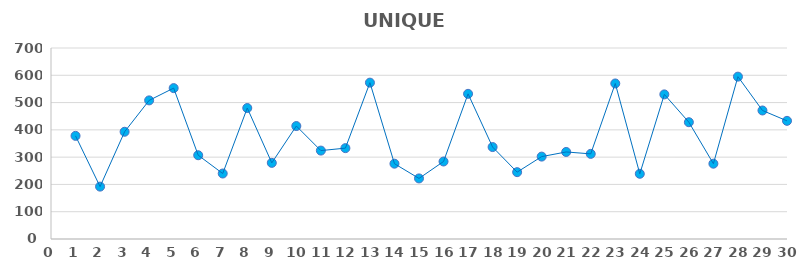
| Category | UNIQUE VISITORS |
|---|---|
| 1.0 | 378 |
| 2.0 | 192 |
| 3.0 | 393 |
| 4.0 | 508 |
| 5.0 | 553 |
| 6.0 | 307 |
| 7.0 | 240 |
| 8.0 | 480 |
| 9.0 | 279 |
| 10.0 | 414 |
| 11.0 | 324 |
| 12.0 | 333 |
| 13.0 | 573 |
| 14.0 | 276 |
| 15.0 | 222 |
| 16.0 | 284 |
| 17.0 | 532 |
| 18.0 | 337 |
| 19.0 | 245 |
| 20.0 | 302 |
| 21.0 | 319 |
| 22.0 | 312 |
| 23.0 | 570 |
| 24.0 | 239 |
| 25.0 | 530 |
| 26.0 | 428 |
| 27.0 | 276 |
| 28.0 | 595 |
| 29.0 | 471 |
| 30.0 | 433 |